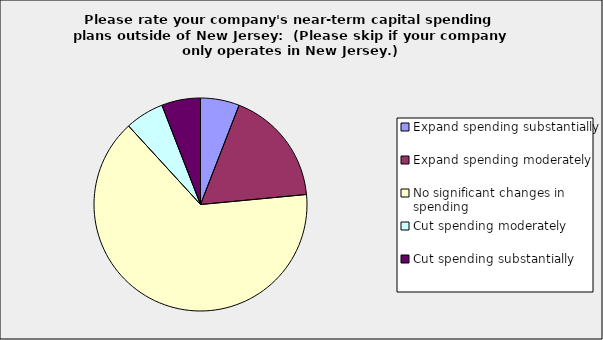
| Category | Series 0 |
|---|---|
| Expand spending substantially | 0.059 |
| Expand spending moderately | 0.176 |
| No significant changes in spending | 0.647 |
| Cut spending moderately | 0.059 |
| Cut spending substantially | 0.059 |